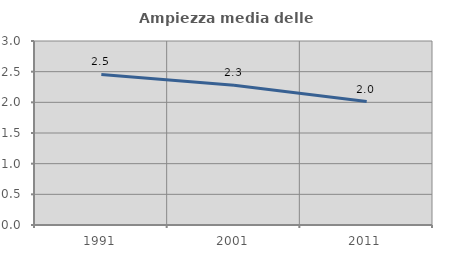
| Category | Ampiezza media delle famiglie |
|---|---|
| 1991.0 | 2.454 |
| 2001.0 | 2.278 |
| 2011.0 | 2.013 |